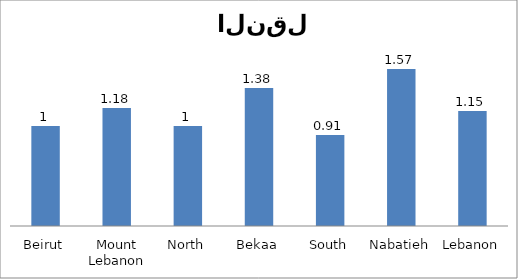
| Category | Series 0 |
|---|---|
| Beirut | 1 |
| Mount Lebanon | 1.18 |
| North | 1 |
| Bekaa | 1.38 |
| South | 0.91 |
| Nabatieh | 1.57 |
| Lebanon | 1.15 |